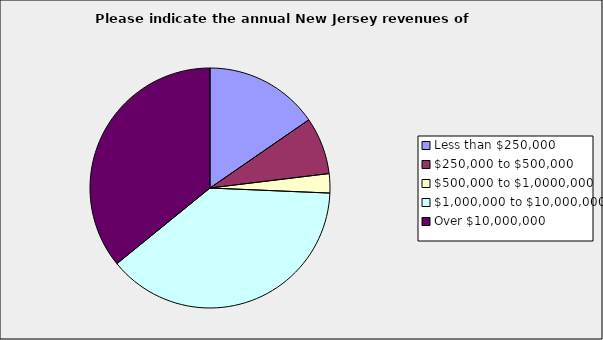
| Category | Series 0 |
|---|---|
| Less than $250,000 | 0.154 |
| $250,000 to $500,000 | 0.077 |
| $500,000 to $1,0000,000 | 0.026 |
| $1,000,000 to $10,000,000 | 0.385 |
| Over $10,000,000 | 0.359 |